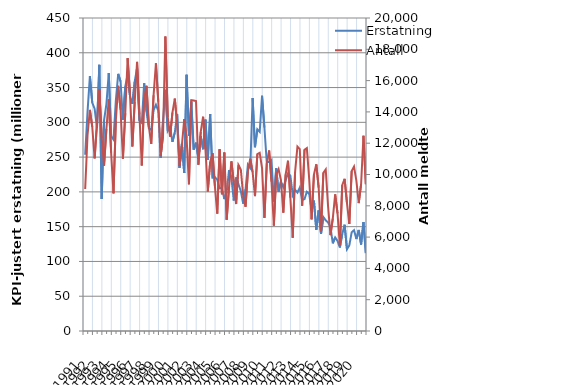
| Category | Erstatning |
|---|---|
| 1991.0 | 253.469 |
| nan | 315.36 |
| nan | 366.519 |
| nan | 328.269 |
| 1992.0 | 319.552 |
| nan | 291.981 |
| nan | 382.641 |
| nan | 189.775 |
| 1993.0 | 302.742 |
| nan | 326.193 |
| nan | 370.855 |
| nan | 280.025 |
| 1994.0 | 275.259 |
| nan | 331.438 |
| nan | 369.692 |
| nan | 358.663 |
| 1995.0 | 303.678 |
| nan | 351.299 |
| nan | 368.914 |
| nan | 337.816 |
| 1996.0 | 326.588 |
| nan | 358.519 |
| nan | 378.266 |
| nan | 302.415 |
| 1997.0 | 298.989 |
| nan | 356.113 |
| nan | 315.206 |
| nan | 291.396 |
| 1998.0 | 289.223 |
| nan | 317.273 |
| nan | 325.337 |
| nan | 316.584 |
| 1999.0 | 248.708 |
| nan | 301.782 |
| nan | 346.828 |
| nan | 287.664 |
| 2000.0 | 293.228 |
| nan | 271.936 |
| nan | 285.248 |
| nan | 311.846 |
| 2001.0 | 234.505 |
| nan | 268.968 |
| nan | 227.131 |
| nan | 368.386 |
| 2002.0 | 280.478 |
| nan | 328.826 |
| nan | 260.77 |
| nan | 270.739 |
| 2003.0 | 247.365 |
| nan | 280.296 |
| nan | 261.363 |
| nan | 303.899 |
| 2004.0 | 246.119 |
| nan | 312.001 |
| nan | 220.435 |
| nan | 221.355 |
| 2005.0 | 217.579 |
| nan | 205.064 |
| nan | 205.915 |
| nan | 189.628 |
| 2006.0 | 200.078 |
| nan | 231.376 |
| nan | 220.674 |
| nan | 187.581 |
| 2007.0 | 220.694 |
| nan | 210.821 |
| nan | 201.064 |
| nan | 183.119 |
| 2008.0 | 203.451 |
| nan | 239.218 |
| nan | 234.438 |
| nan | 334.908 |
| 2009.0 | 264.21 |
| nan | 289.974 |
| nan | 286.344 |
| nan | 338.202 |
| 2010.0 | 292.603 |
| nan | 242.276 |
| nan | 243.27 |
| nan | 246.171 |
| 2011.0 | 186.198 |
| nan | 233.898 |
| nan | 200.278 |
| nan | 214.975 |
| 2012.0 | 206.705 |
| nan | 216.668 |
| nan | 226.437 |
| nan | 223.463 |
| 2013.0 | 195.495 |
| nan | 203.199 |
| nan | 199.023 |
| nan | 206.2 |
| 2014.0 | 188.402 |
| nan | 189.607 |
| nan | 200.172 |
| nan | 197.056 |
| 2015.0 | 173.901 |
| nan | 187.368 |
| nan | 145.441 |
| nan | 173.337 |
| 2016.0 | 139.594 |
| nan | 163.833 |
| nan | 159.014 |
| nan | 156.137 |
| 2017.0 | 149.352 |
| nan | 126.055 |
| nan | 134.611 |
| nan | 129.438 |
| 2018.0 | 120.035 |
| nan | 139.312 |
| nan | 152.844 |
| nan | 117.524 |
| 2019.0 | 123.081 |
| nan | 141.817 |
| nan | 144.981 |
| nan | 132.183 |
| 2020.0 | 145.263 |
| nan | 124.327 |
| nan | 156.604 |
| nan | 111.947 |